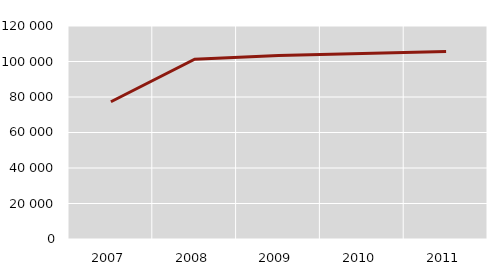
| Category | Промет |
|---|---|
| 2007.0 | 77341.48 |
| 2008.0 | 101297.583 |
| 2009.0 | 103334.702 |
| 2010.0 | 104471.9 |
| 2011.0 | 105607.163 |